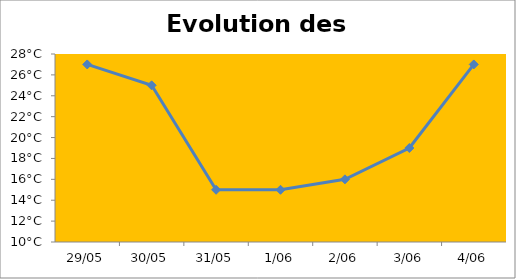
| Category | Températures |
|---|---|
| 2012-05-29 | 27 |
| 2012-05-30 | 25 |
| 2012-05-31 | 15 |
| 2012-06-01 | 15 |
| 2012-06-02 | 16 |
| 2012-06-03 | 19 |
| 2012-06-04 | 27 |